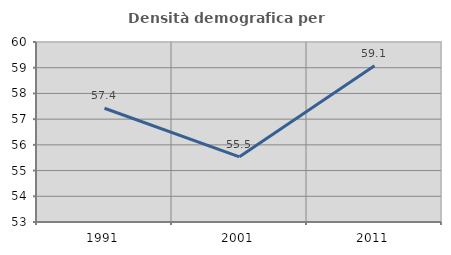
| Category | Densità demografica |
|---|---|
| 1991.0 | 57.424 |
| 2001.0 | 55.534 |
| 2011.0 | 59.079 |